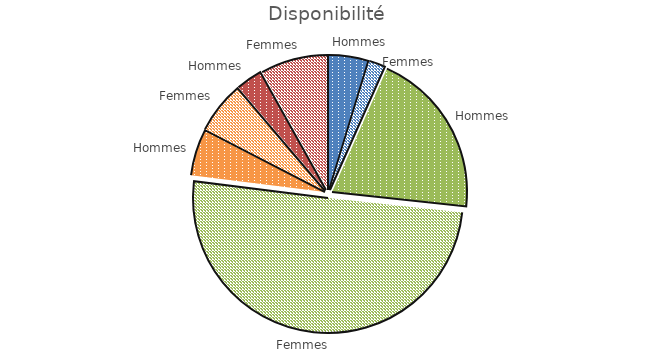
| Category | Disponibilité |
|---|---|
| 0 | 4.713 |
| 1 | 1.952 |
| 2 | 20.039 |
| 3 | 50.284 |
| 4 | 5.595 |
| 5 | 6.19 |
| 6 | 3.128 |
| 7 | 8.098 |